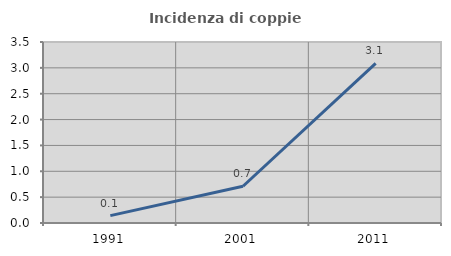
| Category | Incidenza di coppie miste |
|---|---|
| 1991.0 | 0.143 |
| 2001.0 | 0.71 |
| 2011.0 | 3.086 |